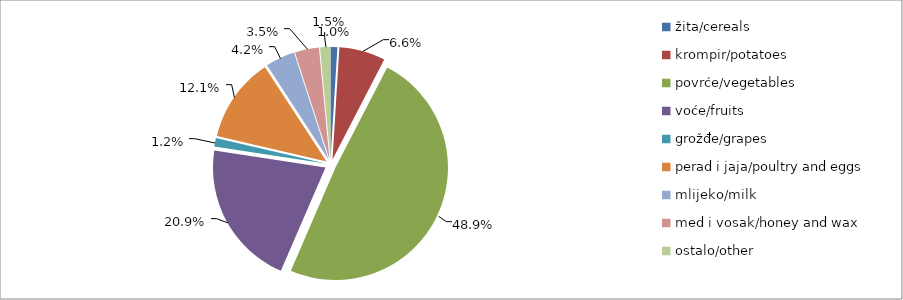
| Category | Series 0 |
|---|---|
| žita/cereals | 15264 |
| krompir/potatoes | 103683 |
| povrće/vegetables | 765041.5 |
| voće/fruits | 327354 |
| grožđe/grapes | 19390 |
| perad i jaja/poultry and eggs | 189961 |
| mlijeko/milk | 66423 |
| med i vosak/honey and wax | 54185 |
| ostalo/other | 23400 |